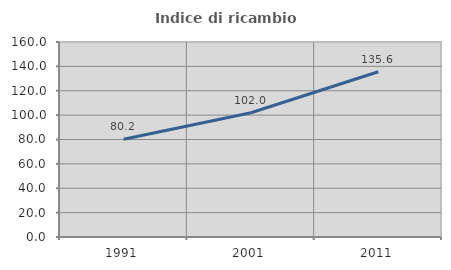
| Category | Indice di ricambio occupazionale  |
|---|---|
| 1991.0 | 80.159 |
| 2001.0 | 101.987 |
| 2011.0 | 135.556 |